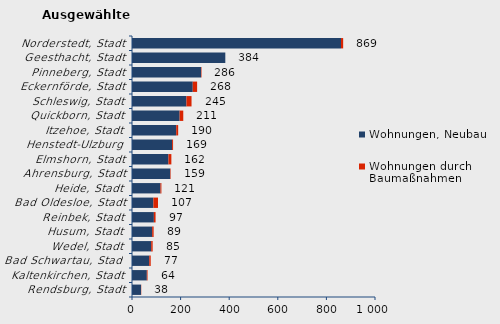
| Category | Wohnungen, Neubau | Wohnungen durch Baumaßnahmen | Series 2 |
|---|---|---|---|
| Rendsburg, Stadt | 37 | 1 | 38 |
| Kaltenkirchen, Stadt | 61 | 3 | 64 |
| Bad Schwartau, Stadt | 71 | 6 | 77 |
| Wedel, Stadt | 79 | 6 | 85 |
| Husum, Stadt | 83 | 6 | 89 |
| Reinbek, Stadt | 90 | 7 | 97 |
| Bad Oldesloe, Stadt | 88 | 19 | 107 |
| Heide, Stadt | 117 | 4 | 121 |
| Ahrensburg, Stadt | 157 | 2 | 159 |
| Elmshorn, Stadt | 150 | 12 | 162 |
| Henstedt-Ulzburg | 165 | 4 | 169 |
| Itzehoe, Stadt | 182 | 8 | 190 |
| Quickborn, Stadt | 196 | 15 | 211 |
| Schleswig, Stadt | 224 | 21 | 245 |
| Eckernförde, Stadt | 250 | 18 | 268 |
| Pinneberg, Stadt | 284 | 2 | 286 |
| Geesthacht, Stadt | 384 | 0 | 384 |
| Norderstedt, Stadt | 860 | 9 | 869 |